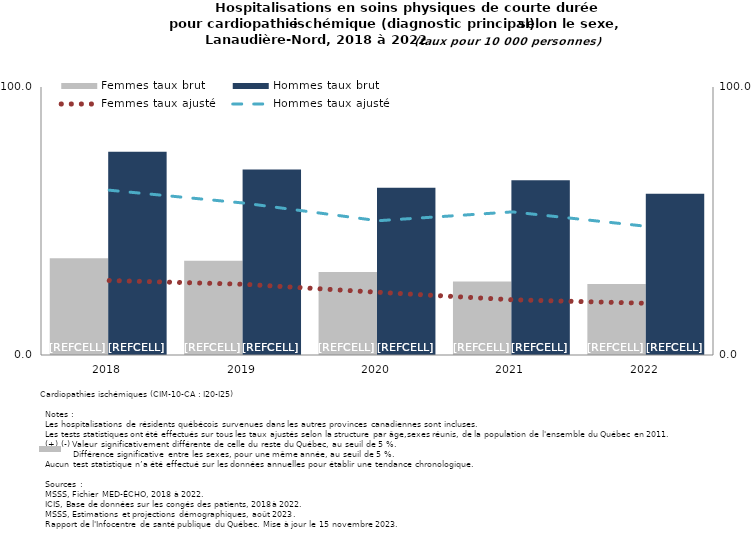
| Category | Femmes taux brut | Hommes taux brut |
|---|---|---|
| 2018.0 | 36.1 | 75.8 |
| 2019.0 | 35.2 | 69.2 |
| 2020.0 | 31 | 62.4 |
| 2021.0 | 27.4 | 65.2 |
| 2022.0 | 26.5 | 60.2 |